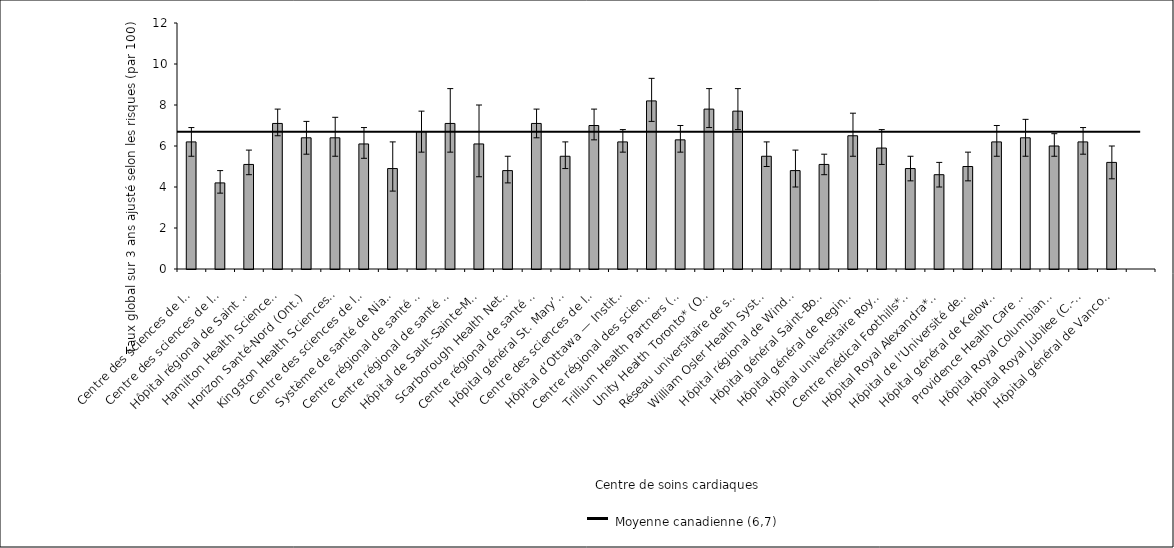
| Category | Taux ajusté selon les risques |
|---|---|
| Centre des sciences de la santé — St. John’s (T. -N.-L.) | 6.2 |
| Centre des sciences de la santé Queen Elizabeth II* (N.-É.) | 4.2 |
| Hôpital régional de Saint John* (N.-B.) | 5.1 |
| Hamilton Health Sciences (Ont.) | 7.1 |
| Horizon Santé-Nord (Ont.) | 6.4 |
| Kingston Health Sciences Centre (Ont.) | 6.4 |
| Centre des sciences de la santé de London (Ont.) | 6.1 |
| Système de santé de Niagara* (Ont.) | 4.9 |
| Centre régional de santé de Peterborough (Ont.) | 6.7 |
| Centre régional de santé Royal Victoria (Ont.) | 7.1 |
| Hôpital de Sault-Sainte-Marie (Ont.) | 6.1 |
| Scarborough Health Network* (Ont.) | 4.8 |
| Centre régional de santé Southlake (Ont.) | 7.1 |
| Hôpital général St. Mary’s* (Ont.) | 5.5 |
| Centre des sciences de la santé Sunnybrook (Ont.) | 7 |
| Hôpital d’Ottawa — Institut de cardiologie de l’Université d’Ottawa (Ont.) | 6.2 |
| Centre régional des sciences de la santé de Thunder Bay* (Ont.) | 8.2 |
| Trillium Health Partners (Ont.) | 6.3 |
| Unity Health Toronto* (Ont.) | 7.8 |
| Réseau universitaire de santé* (Ont.) | 7.7 |
| William Osler Health System* (Ont.) | 5.5 |
| Hôpital régional de Windsor* (Ont.) | 4.8 |
| Hôpital général Saint-Boniface* (Man.) | 5.1 |
| Hôpital général de Regina (Sask.) | 6.5 |
| Hôpital universitaire Royal (Sask.) | 5.9 |
| Centre médical Foothills* (Alb.) | 4.9 |
| Hôpital Royal Alexandra* (Alb.) | 4.6 |
| Hôpital de l’Université de l’Alberta* (Alb.) | 5 |
| Hôpital général de Kelowna (C.-B.) | 6.2 |
| Providence Health Care — Hôpital St. Paul’s (Vancouver) (C.-B.) | 6.4 |
| Hôpital Royal Columbian* (C.-B.) | 6 |
| Hôpital Royal Jubilee (C.-B.) | 6.2 |
| Hôpital général de Vancouver* (C.-B.) | 5.2 |